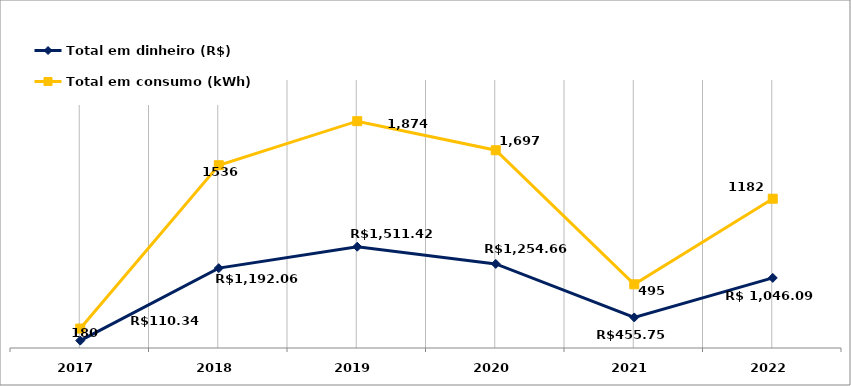
| Category | Total em dinheiro (R$) | Total em consumo (kWh) |
|---|---|---|
| 2017.0 | 110.34 | 180 |
| 2018.0 | 1192.06 | 1536 |
| 2019.0 | 1511.42 | 1874 |
| 2020.0 | 1254.66 | 1697 |
| 2021.0 | 455.75 | 495 |
| 2022.0 | 1046.09 | 1182 |